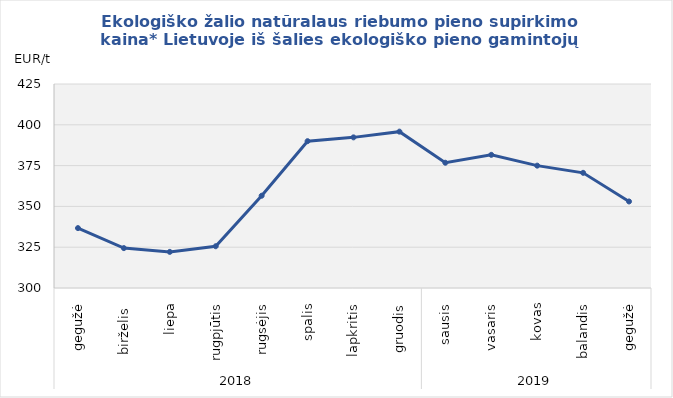
| Category | Ekologiško žalio natūralaus riebumo pieno supirkimo kaina* Lietuvoje iš šalies ekologiško pieno gamintojų |
|---|---|
| 0 | 336.7 |
| 1 | 324.44 |
| 2 | 322.13 |
| 3 | 325.59 |
| 4 | 356.54 |
| 5 | 389.97 |
| 6 | 392.3 |
| 7 | 395.81 |
| 8 | 376.75 |
| 9 | 381.6 |
| 10 | 374.97 |
| 11 | 370.57 |
| 12 | 353.02 |